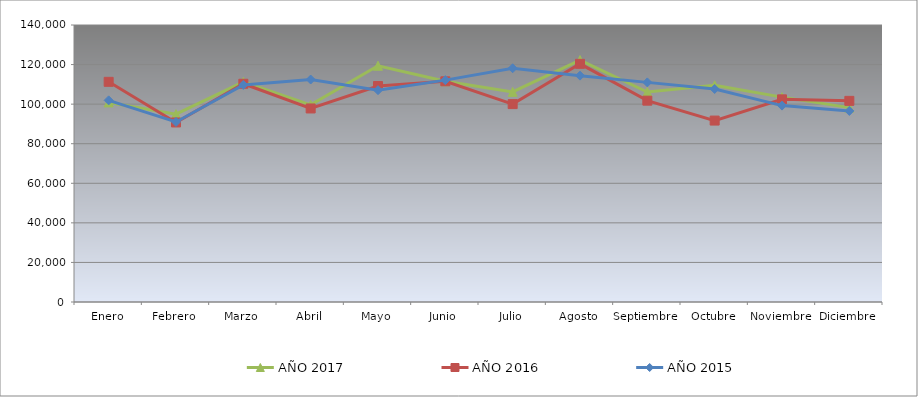
| Category | AÑO 2017 | AÑO 2016 | AÑO 2015 |
|---|---|---|---|
| Enero | 100880 | 111280 | 101920 |
| Febrero | 94960 | 90740 | 90980 |
| Marzo | 111260 | 110300 | 109720 |
| Abril | 99640 | 97820 | 112440 |
| Mayo | 119400 | 109160 | 107060 |
| Junio | 111600 | 111540 | 112140 |
| Julio | 106200 | 100020 | 118140 |
| Agosto | 122280 | 120380 | 114400 |
| Septiembre | 106120 | 101760 | 111000 |
| Octubre | 109520 | 91700 | 107660 |
| Noviembre | 103540 | 102420 | 99260 |
| Diciembre | 98240 | 101660 | 96560 |